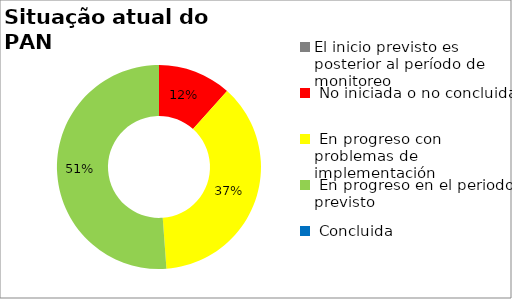
| Category | Series 0 |
|---|---|
| El inicio previsto es posterior al período de monitoreo | 0 |
|  No iniciada o no concluida | 0.116 |
|  En progreso con problemas de implementación | 0.372 |
|  En progreso en el periodo previsto | 0.512 |
|  Concluida | 0 |